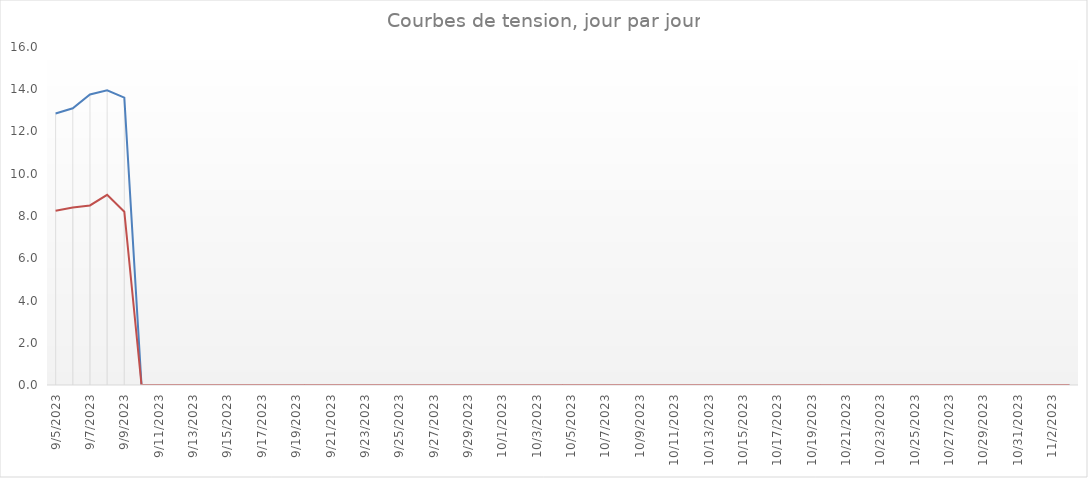
| Category | Moyenne tension jour SYS | Moyenne tension jour DIA |
|---|---|---|
| 9/5/23 | 12.85 | 8.25 |
| 9/6/23 | 13.1 | 8.4 |
| 9/7/23 | 13.75 | 8.5 |
| 9/8/23 | 13.95 | 9 |
| 9/9/23 | 13.6 | 8.2 |
| 9/10/23 | 0 | 0 |
| 9/11/23 | 0 | 0 |
| 9/12/23 | 0 | 0 |
| 9/13/23 | 0 | 0 |
| 9/14/23 | 0 | 0 |
| 9/15/23 | 0 | 0 |
| 9/16/23 | 0 | 0 |
| 9/17/23 | 0 | 0 |
| 9/18/23 | 0 | 0 |
| 9/19/23 | 0 | 0 |
| 9/20/23 | 0 | 0 |
| 9/21/23 | 0 | 0 |
| 9/22/23 | 0 | 0 |
| 9/23/23 | 0 | 0 |
| 9/24/23 | 0 | 0 |
| 9/25/23 | 0 | 0 |
| 9/26/23 | 0 | 0 |
| 9/27/23 | 0 | 0 |
| 9/28/23 | 0 | 0 |
| 9/29/23 | 0 | 0 |
| 9/30/23 | 0 | 0 |
| 10/1/23 | 0 | 0 |
| 10/2/23 | 0 | 0 |
| 10/3/23 | 0 | 0 |
| 10/4/23 | 0 | 0 |
| 10/5/23 | 0 | 0 |
| 10/6/23 | 0 | 0 |
| 10/7/23 | 0 | 0 |
| 10/8/23 | 0 | 0 |
| 10/9/23 | 0 | 0 |
| 10/10/23 | 0 | 0 |
| 10/11/23 | 0 | 0 |
| 10/12/23 | 0 | 0 |
| 10/13/23 | 0 | 0 |
| 10/14/23 | 0 | 0 |
| 10/15/23 | 0 | 0 |
| 10/16/23 | 0 | 0 |
| 10/17/23 | 0 | 0 |
| 10/18/23 | 0 | 0 |
| 10/19/23 | 0 | 0 |
| 10/20/23 | 0 | 0 |
| 10/21/23 | 0 | 0 |
| 10/22/23 | 0 | 0 |
| 10/23/23 | 0 | 0 |
| 10/24/23 | 0 | 0 |
| 10/25/23 | 0 | 0 |
| 10/26/23 | 0 | 0 |
| 10/27/23 | 0 | 0 |
| 10/28/23 | 0 | 0 |
| 10/29/23 | 0 | 0 |
| 10/30/23 | 0 | 0 |
| 10/31/23 | 0 | 0 |
| 11/1/23 | 0 | 0 |
| 11/2/23 | 0 | 0 |
| 11/3/23 | 0 | 0 |